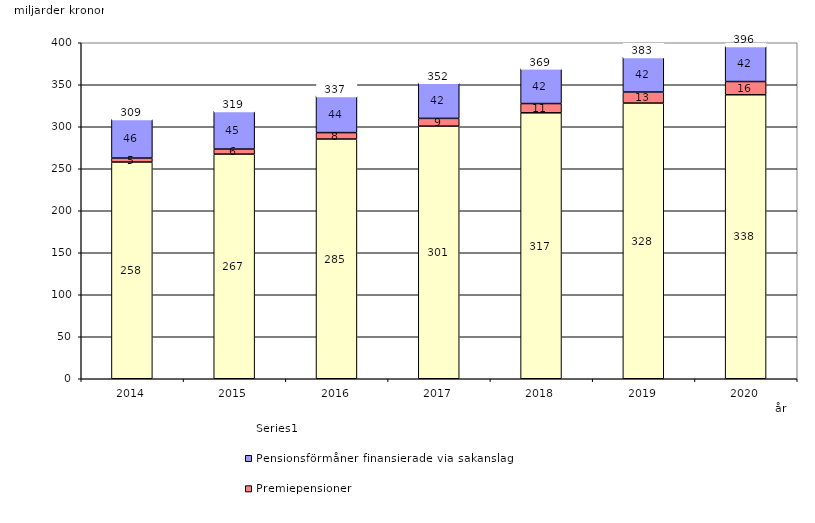
| Category | Inkomstpension och tilläggspension m.m. | Premiepensioner | Pensionsförmåner finansierade via sakanslag | Series 0 |
|---|---|---|---|---|
| 2014.0 | 257.988 | 4.739 | 46.4 | 20 |
| 2015.0 | 267.44 | 6.008 | 45.361 | 20 |
| 2016.0 | 285.383 | 7.647 | 43.719 | 20 |
| 2017.0 | 300.749 | 9.229 | 42.42 | 20 |
| 2018.0 | 316.586 | 11.036 | 41.594 | 20 |
| 2019.0 | 328.181 | 13.184 | 41.738 | 20 |
| 2020.0 | 338.106 | 15.722 | 42.38 | 20 |